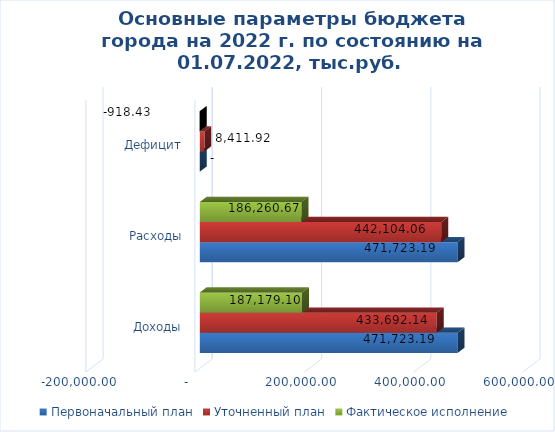
| Category | Первоначальный план | Уточненный план | Фактическое исполнение |
|---|---|---|---|
| Доходы | 471723.19 | 433692.14 | 187179.1 |
| Расходы | 471723.19 | 442104.06 | 186260.67 |
| Дефицит | 0 | 8411.92 | -918.43 |